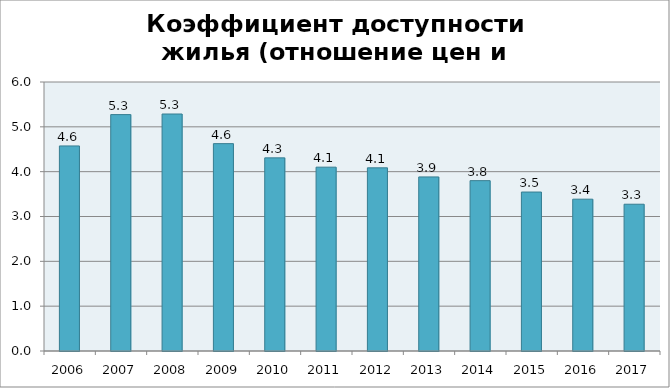
| Category | Series 0 |
|---|---|
| 2006.0 | 4.574 |
| 2007.0 | 5.273 |
| 2008.0 | 5.286 |
| 2009.0 | 4.625 |
| 2010.0 | 4.308 |
| 2011.0 | 4.1 |
| 2012.0 | 4.085 |
| 2013.0 | 3.883 |
| 2014.0 | 3.8 |
| 2015.0 | 3.546 |
| 2016.0 | 3.386 |
| 2017.0 | 3.274 |